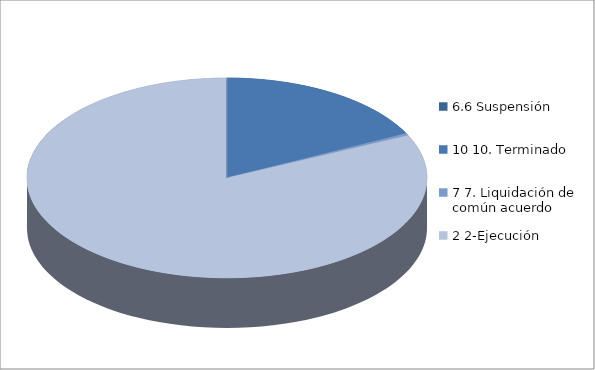
| Category | Series 0 |
|---|---|
| 6.6 Suspensión | 0 |
| 10 10. Terminado | 99 |
| 7 7. Liquidación de común acuerdo | 2 |
| 2 2-Ejecución | 461 |